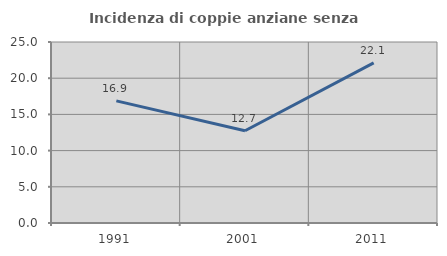
| Category | Incidenza di coppie anziane senza figli  |
|---|---|
| 1991.0 | 16.867 |
| 2001.0 | 12.745 |
| 2011.0 | 22.124 |